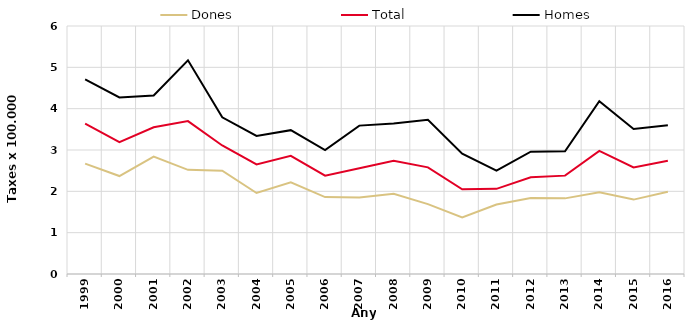
| Category | Dones | Total | Homes |
|---|---|---|---|
| 1999.0 | 2.67 | 3.64 | 4.71 |
| 2000.0 | 2.37 | 3.19 | 4.27 |
| 2001.0 | 2.84 | 3.55 | 4.32 |
| 2002.0 | 2.52 | 3.7 | 5.17 |
| 2003.0 | 2.5 | 3.11 | 3.79 |
| 2004.0 | 1.96 | 2.65 | 3.34 |
| 2005.0 | 2.22 | 2.86 | 3.48 |
| 2006.0 | 1.86 | 2.38 | 3 |
| 2007.0 | 1.85 | 2.56 | 3.59 |
| 2008.0 | 1.94 | 2.74 | 3.64 |
| 2009.0 | 1.69 | 2.58 | 3.73 |
| 2010.0 | 1.37 | 2.05 | 2.91 |
| 2011.0 | 1.68 | 2.06 | 2.5 |
| 2012.0 | 1.84 | 2.34 | 2.96 |
| 2013.0 | 1.83 | 2.38 | 2.97 |
| 2014.0 | 1.98 | 2.98 | 4.18 |
| 2015.0 | 1.8 | 2.58 | 3.51 |
| 2016.0 | 1.99 | 2.74 | 3.6 |